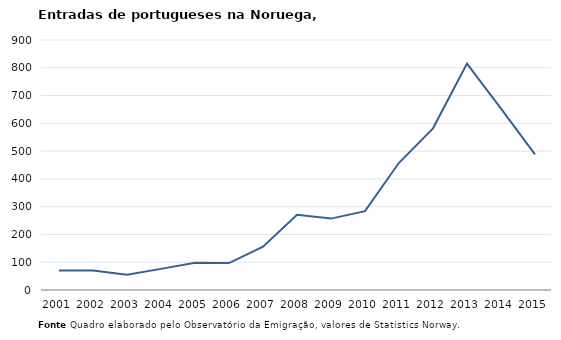
| Category | Entradas |
|---|---|
| 2001.0 | 70 |
| 2002.0 | 70 |
| 2003.0 | 55 |
| 2004.0 | 76 |
| 2005.0 | 98 |
| 2006.0 | 97 |
| 2007.0 | 156 |
| 2008.0 | 271 |
| 2009.0 | 257 |
| 2010.0 | 284 |
| 2011.0 | 458 |
| 2012.0 | 582 |
| 2013.0 | 815 |
| 2014.0 | 653 |
| 2015.0 | 488 |